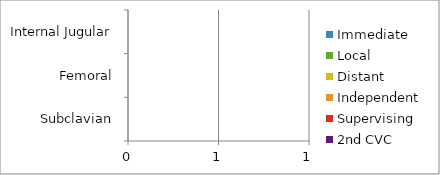
| Category | Immediate | Local | Distant | Independent | Supervising | 2nd CVC |
|---|---|---|---|---|---|---|
| Internal Jugular | 0 | 0 | 0 | 0 | 0 | 0 |
| Femoral | 0 | 0 | 0 | 0 | 0 | 0 |
| Subclavian | 0 | 0 | 0 | 0 | 0 | 0 |